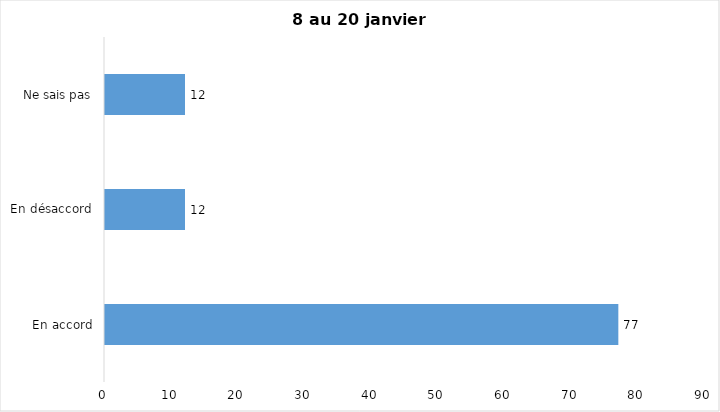
| Category | J’ai l’intention de recevoir le vaccin contre la COVID-19 lorsqu’il
sera disponible |
|---|---|
| En accord | 77 |
| En désaccord | 12 |
| Ne sais pas | 12 |